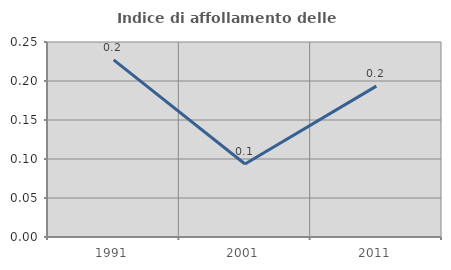
| Category | Indice di affollamento delle abitazioni  |
|---|---|
| 1991.0 | 0.227 |
| 2001.0 | 0.094 |
| 2011.0 | 0.193 |